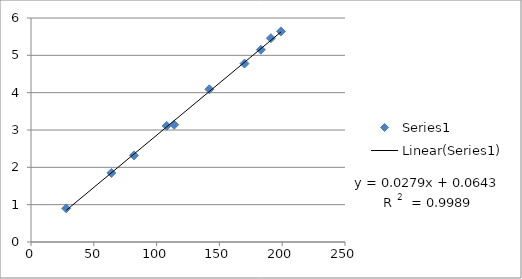
| Category | Series 0 |
|---|---|
| 199.0 | 5.64 |
| 108.0 | 3.11 |
| 183.0 | 5.15 |
| 191.0 | 5.46 |
| 170.0 | 4.78 |
| 142.0 | 4.09 |
| 28.0 | 0.9 |
| 64.0 | 1.85 |
| 82.0 | 2.32 |
| 114.0 | 3.14 |